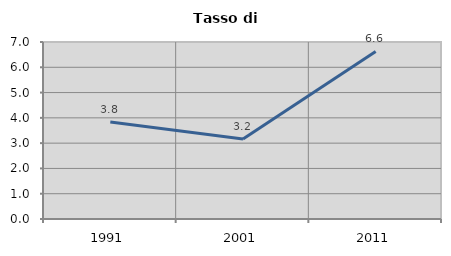
| Category | Tasso di disoccupazione   |
|---|---|
| 1991.0 | 3.836 |
| 2001.0 | 3.168 |
| 2011.0 | 6.629 |